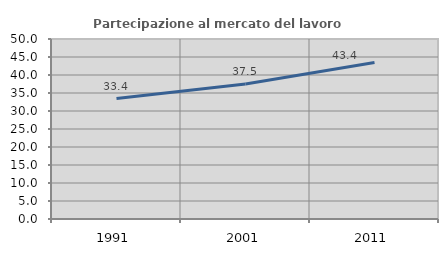
| Category | Partecipazione al mercato del lavoro  femminile |
|---|---|
| 1991.0 | 33.447 |
| 2001.0 | 37.5 |
| 2011.0 | 43.446 |